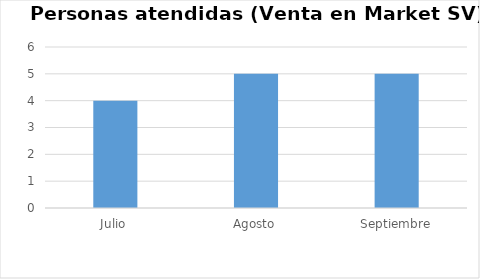
| Category | Series 0 |
|---|---|
| Julio | 4 |
| Agosto | 5 |
| Septiembre | 5 |